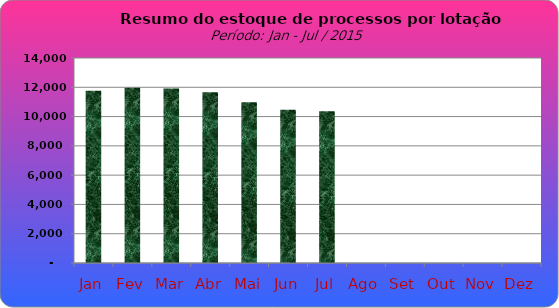
| Category | Series 0 |
|---|---|
| Jan | 11768 |
| Fev | 11973 |
| Mar | 11918 |
| Abr | 11669 |
| Mai | 10977 |
| Jun | 10462 |
| Jul | 10364 |
| Ago | 0 |
| Set | 0 |
| Out | 0 |
| Nov | 0 |
| Dez | 0 |